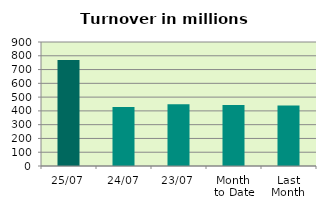
| Category | Series 0 |
|---|---|
| 25/07 | 769.655 |
| 24/07 | 428.253 |
| 23/07 | 447.977 |
| Month 
to Date | 442.353 |
| Last
Month | 439.695 |